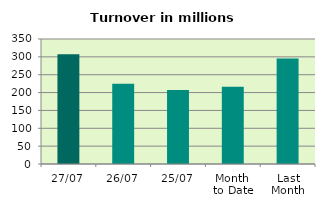
| Category | Series 0 |
|---|---|
| 27/07 | 307.168 |
| 26/07 | 224.645 |
| 25/07 | 207.098 |
| Month 
to Date | 216.118 |
| Last
Month | 295.453 |